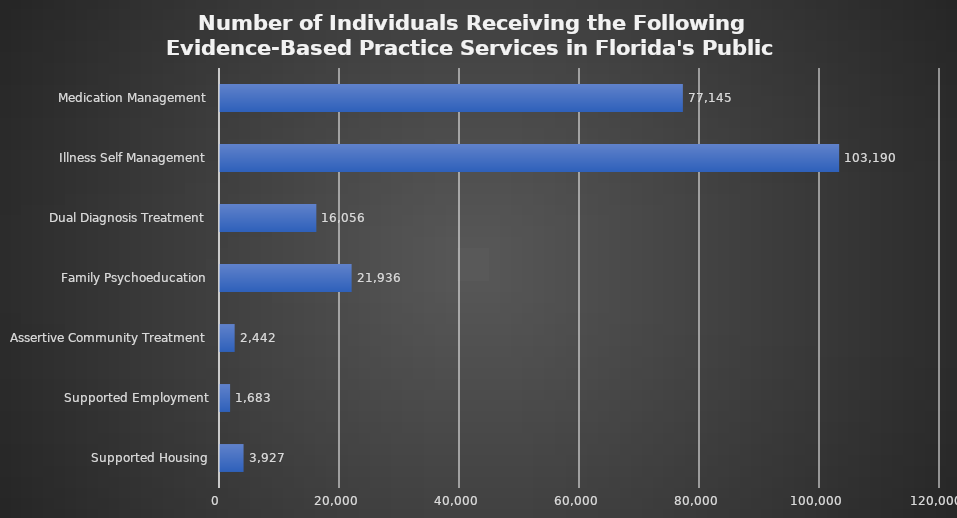
| Category | Series 0 |
|---|---|
| Supported Housing | 3927 |
| Supported Employment | 1683 |
| Assertive Community Treatment | 2442 |
| Family Psychoeducation | 21936 |
| Dual Diagnosis Treatment | 16056 |
| Illness Self Management | 103190 |
| Medication Management | 77145 |